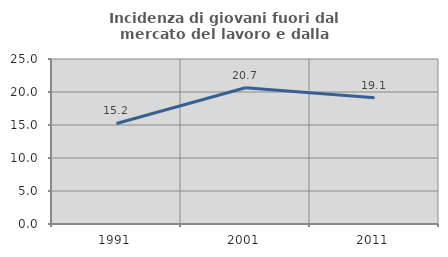
| Category | Incidenza di giovani fuori dal mercato del lavoro e dalla formazione  |
|---|---|
| 1991.0 | 15.235 |
| 2001.0 | 20.653 |
| 2011.0 | 19.138 |